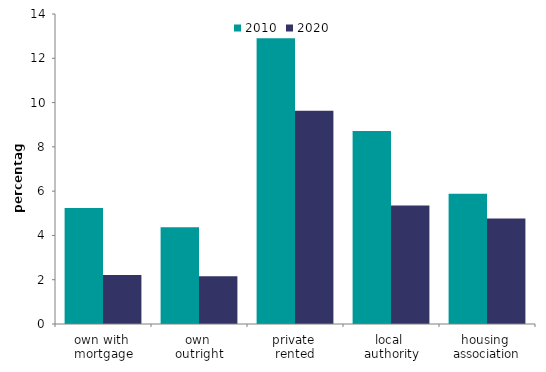
| Category | 2010 | 2020 |
|---|---|---|
| own with 
mortgage | 5.238 | 2.216 |
| own 
outright | 4.366 | 2.156 |
| private 
rented | 12.91 | 9.631 |
| local 
authority | 8.715 | 5.352 |
| housing 
association | 5.883 | 4.76 |